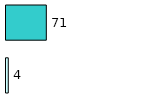
| Category | Series 0 | Series 1 |
|---|---|---|
| 0 | 4 | 71 |